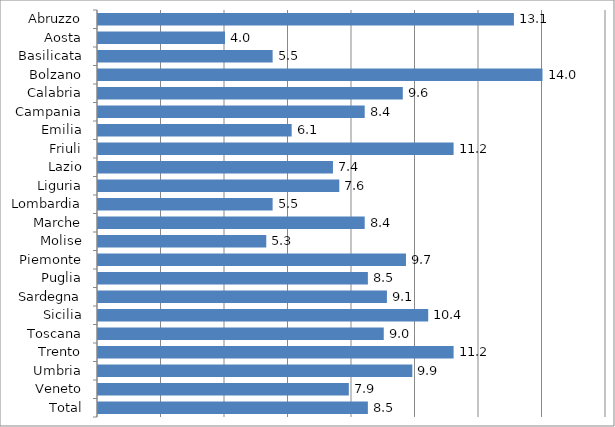
| Category | Regioni |
|---|---|
| Abruzzo | 13.1 |
| Aosta | 4 |
| Basilicata | 5.5 |
| Bolzano | 14 |
| Calabria | 9.6 |
| Campania | 8.4 |
| Emilia | 6.1 |
| Friuli | 11.2 |
| Lazio | 7.4 |
| Liguria | 7.6 |
| Lombardia | 5.5 |
| Marche | 8.4 |
| Molise | 5.3 |
| Piemonte | 9.7 |
| Puglia | 8.5 |
| Sardegna | 9.1 |
| Sicilia | 10.4 |
| Toscana | 9 |
| Trento | 11.2 |
| Umbria | 9.9 |
| Veneto | 7.9 |
| Total | 8.5 |